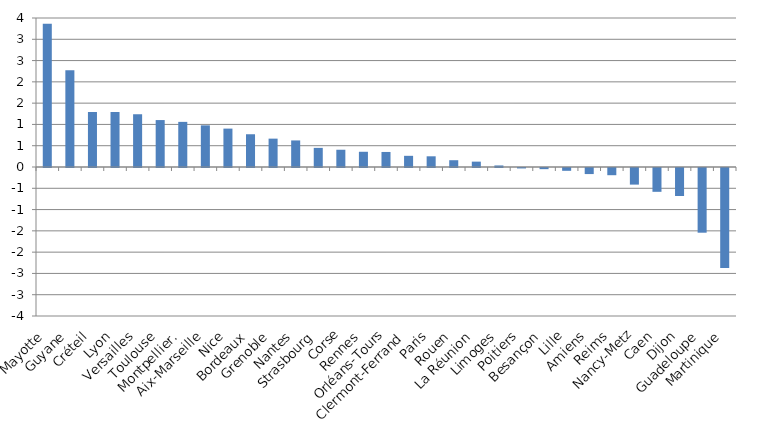
| Category | Evolution en % |
|---|---|
| Mayotte | 3.367 |
| Guyane | 2.271 |
| Créteil | 1.292 |
| Lyon | 1.291 |
| Versailles | 1.239 |
| Toulouse | 1.103 |
| Montpellier. | 1.06 |
| Aix-Marseille | 0.978 |
| Nice | 0.902 |
| Bordeaux | 0.769 |
| Grenoble | 0.666 |
| Nantes | 0.624 |
| Strasbourg | 0.449 |
| Corse | 0.405 |
| Rennes | 0.358 |
| Orléans-Tours | 0.353 |
| Clermont-Ferrand | 0.263 |
| Paris | 0.251 |
| Rouen | 0.159 |
| La Réunion | 0.126 |
| Limoges | 0.036 |
| Poitiers | -0.01 |
| Besançon | -0.027 |
| Lille | -0.066 |
| Amiens | -0.143 |
| Reims | -0.169 |
| Nancy-Metz | -0.39 |
| Caen | -0.56 |
| Dijon | -0.658 |
| Guadeloupe | -1.52 |
| Martinique | -2.346 |